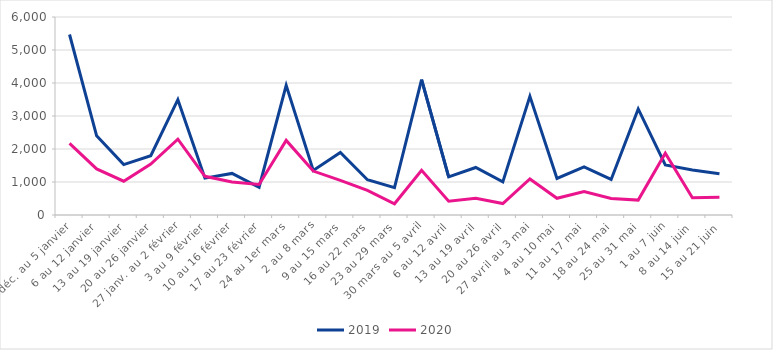
| Category | 2019 | 2020 |
|---|---|---|
| 30 déc. au 5 janvier | 5470 | 2172 |
| 6 au 12 janvier | 2400 | 1398 |
| 13 au 19 janvier | 1527 | 1025 |
| 20 au 26 janvier | 1798 | 1545 |
| 27 janv. au 2 février | 3495 | 2297 |
| 3 au 9 février | 1116 | 1173 |
| 10 au 16 février | 1260 | 1003 |
| 17 au 23 février | 841 | 926 |
| 24 au 1er mars | 3928 | 2261 |
| 2 au 8 mars | 1349 | 1331 |
| 9 au 15 mars | 1893 | 1051 |
| 16 au 22 mars | 1068 | 746 |
| 23 au 29 mars | 828 | 339 |
| 30 mars au 5 avril | 4105 | 1352 |
| 6 au 12 avril | 1156 | 416 |
| 13 au 19 avril | 1440 | 507 |
| 20 au 26 avril | 1002 | 348 |
| 27 avril au 3 mai | 3595 | 1093 |
| 4 au 10 mai | 1106 | 506 |
| 11 au 17 mai | 1456 | 713 |
| 18 au 24 mai | 1078 | 500 |
| 25 au 31 mai | 3215 | 451 |
| 1 au 7 juin | 1515 | 1872 |
| 8 au 14 juin | 1366 | 521 |
| 15 au 21 juin | 1252 | 540 |